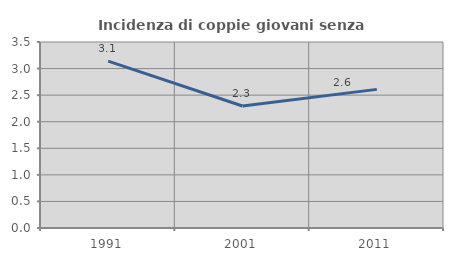
| Category | Incidenza di coppie giovani senza figli |
|---|---|
| 1991.0 | 3.141 |
| 2001.0 | 2.296 |
| 2011.0 | 2.609 |